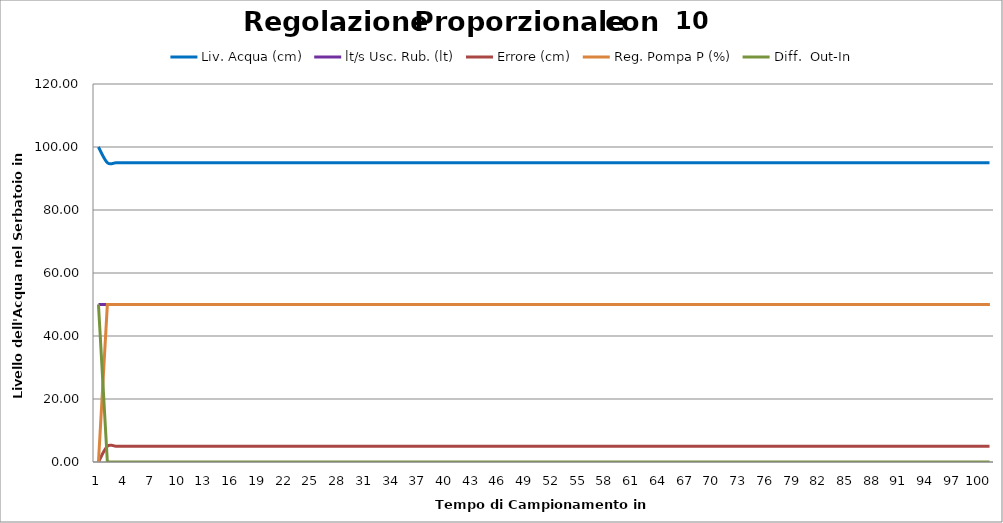
| Category | Liv. Acqua (cm) | lt/s Usc. Rub. (lt) | Errore (cm) | Reg. Pompa P (%) | Diff.  Out-In |
|---|---|---|---|---|---|
| 0 | 100 | 50 | 0 | 0 | 50 |
| 1 | 95 | 50 | 5 | 50 | 0 |
| 2 | 95 | 50 | 5 | 50 | 0 |
| 3 | 95 | 50 | 5 | 50 | 0 |
| 4 | 95 | 50 | 5 | 50 | 0 |
| 5 | 95 | 50 | 5 | 50 | 0 |
| 6 | 95 | 50 | 5 | 50 | 0 |
| 7 | 95 | 50 | 5 | 50 | 0 |
| 8 | 95 | 50 | 5 | 50 | 0 |
| 9 | 95 | 50 | 5 | 50 | 0 |
| 10 | 95 | 50 | 5 | 50 | 0 |
| 11 | 95 | 50 | 5 | 50 | 0 |
| 12 | 95 | 50 | 5 | 50 | 0 |
| 13 | 95 | 50 | 5 | 50 | 0 |
| 14 | 95 | 50 | 5 | 50 | 0 |
| 15 | 95 | 50 | 5 | 50 | 0 |
| 16 | 95 | 50 | 5 | 50 | 0 |
| 17 | 95 | 50 | 5 | 50 | 0 |
| 18 | 95 | 50 | 5 | 50 | 0 |
| 19 | 95 | 50 | 5 | 50 | 0 |
| 20 | 95 | 50 | 5 | 50 | 0 |
| 21 | 95 | 50 | 5 | 50 | 0 |
| 22 | 95 | 50 | 5 | 50 | 0 |
| 23 | 95 | 50 | 5 | 50 | 0 |
| 24 | 95 | 50 | 5 | 50 | 0 |
| 25 | 95 | 50 | 5 | 50 | 0 |
| 26 | 95 | 50 | 5 | 50 | 0 |
| 27 | 95 | 50 | 5 | 50 | 0 |
| 28 | 95 | 50 | 5 | 50 | 0 |
| 29 | 95 | 50 | 5 | 50 | 0 |
| 30 | 95 | 50 | 5 | 50 | 0 |
| 31 | 95 | 50 | 5 | 50 | 0 |
| 32 | 95 | 50 | 5 | 50 | 0 |
| 33 | 95 | 50 | 5 | 50 | 0 |
| 34 | 95 | 50 | 5 | 50 | 0 |
| 35 | 95 | 50 | 5 | 50 | 0 |
| 36 | 95 | 50 | 5 | 50 | 0 |
| 37 | 95 | 50 | 5 | 50 | 0 |
| 38 | 95 | 50 | 5 | 50 | 0 |
| 39 | 95 | 50 | 5 | 50 | 0 |
| 40 | 95 | 50 | 5 | 50 | 0 |
| 41 | 95 | 50 | 5 | 50 | 0 |
| 42 | 95 | 50 | 5 | 50 | 0 |
| 43 | 95 | 50 | 5 | 50 | 0 |
| 44 | 95 | 50 | 5 | 50 | 0 |
| 45 | 95 | 50 | 5 | 50 | 0 |
| 46 | 95 | 50 | 5 | 50 | 0 |
| 47 | 95 | 50 | 5 | 50 | 0 |
| 48 | 95 | 50 | 5 | 50 | 0 |
| 49 | 95 | 50 | 5 | 50 | 0 |
| 50 | 95 | 50 | 5 | 50 | 0 |
| 51 | 95 | 50 | 5 | 50 | 0 |
| 52 | 95 | 50 | 5 | 50 | 0 |
| 53 | 95 | 50 | 5 | 50 | 0 |
| 54 | 95 | 50 | 5 | 50 | 0 |
| 55 | 95 | 50 | 5 | 50 | 0 |
| 56 | 95 | 50 | 5 | 50 | 0 |
| 57 | 95 | 50 | 5 | 50 | 0 |
| 58 | 95 | 50 | 5 | 50 | 0 |
| 59 | 95 | 50 | 5 | 50 | 0 |
| 60 | 95 | 50 | 5 | 50 | 0 |
| 61 | 95 | 50 | 5 | 50 | 0 |
| 62 | 95 | 50 | 5 | 50 | 0 |
| 63 | 95 | 50 | 5 | 50 | 0 |
| 64 | 95 | 50 | 5 | 50 | 0 |
| 65 | 95 | 50 | 5 | 50 | 0 |
| 66 | 95 | 50 | 5 | 50 | 0 |
| 67 | 95 | 50 | 5 | 50 | 0 |
| 68 | 95 | 50 | 5 | 50 | 0 |
| 69 | 95 | 50 | 5 | 50 | 0 |
| 70 | 95 | 50 | 5 | 50 | 0 |
| 71 | 95 | 50 | 5 | 50 | 0 |
| 72 | 95 | 50 | 5 | 50 | 0 |
| 73 | 95 | 50 | 5 | 50 | 0 |
| 74 | 95 | 50 | 5 | 50 | 0 |
| 75 | 95 | 50 | 5 | 50 | 0 |
| 76 | 95 | 50 | 5 | 50 | 0 |
| 77 | 95 | 50 | 5 | 50 | 0 |
| 78 | 95 | 50 | 5 | 50 | 0 |
| 79 | 95 | 50 | 5 | 50 | 0 |
| 80 | 95 | 50 | 5 | 50 | 0 |
| 81 | 95 | 50 | 5 | 50 | 0 |
| 82 | 95 | 50 | 5 | 50 | 0 |
| 83 | 95 | 50 | 5 | 50 | 0 |
| 84 | 95 | 50 | 5 | 50 | 0 |
| 85 | 95 | 50 | 5 | 50 | 0 |
| 86 | 95 | 50 | 5 | 50 | 0 |
| 87 | 95 | 50 | 5 | 50 | 0 |
| 88 | 95 | 50 | 5 | 50 | 0 |
| 89 | 95 | 50 | 5 | 50 | 0 |
| 90 | 95 | 50 | 5 | 50 | 0 |
| 91 | 95 | 50 | 5 | 50 | 0 |
| 92 | 95 | 50 | 5 | 50 | 0 |
| 93 | 95 | 50 | 5 | 50 | 0 |
| 94 | 95 | 50 | 5 | 50 | 0 |
| 95 | 95 | 50 | 5 | 50 | 0 |
| 96 | 95 | 50 | 5 | 50 | 0 |
| 97 | 95 | 50 | 5 | 50 | 0 |
| 98 | 95 | 50 | 5 | 50 | 0 |
| 99 | 95 | 50 | 5 | 50 | 0 |
| 100 | 95 | 50 | 5 | 50 | 0 |